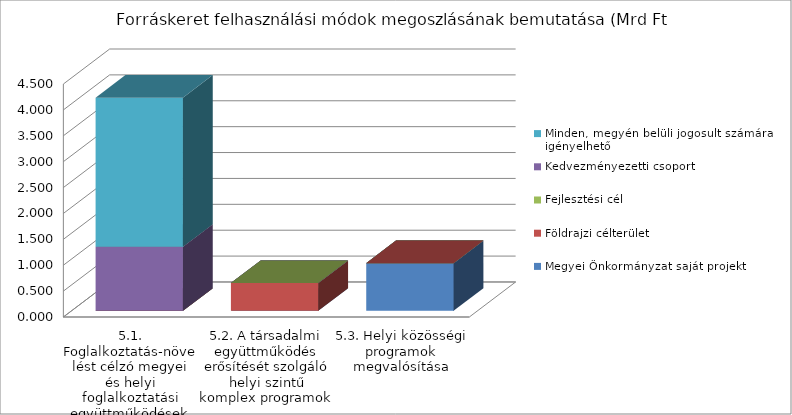
| Category | Megyei Önkormányzat saját projekt | Földrajzi célterület  | Fejlesztési cél  | Kedvezményezetti csoport | Minden, megyén belüli jogosult számára igényelhető |
|---|---|---|---|---|---|
| 5.1. Foglalkoztatás-növelést célzó megyei és helyi foglalkoztatási együttműködések (paktumok) | 0 | 0 | 0 | 1.235 | 2.882 |
| 5.2. A társadalmi együttműködés erősítését szolgáló helyi szintű komplex programok  | 0 | 0.536 | 0 | 0 | 0 |
| 5.3. Helyi közösségi programok megvalósítása | 0.919 | 0 | 0 | 0 | 0 |